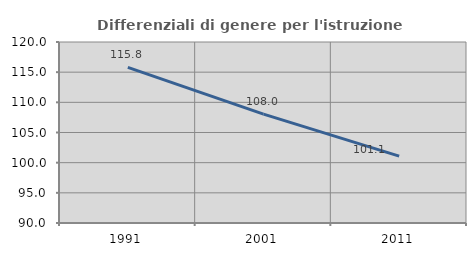
| Category | Differenziali di genere per l'istruzione superiore |
|---|---|
| 1991.0 | 115.805 |
| 2001.0 | 108.047 |
| 2011.0 | 101.088 |